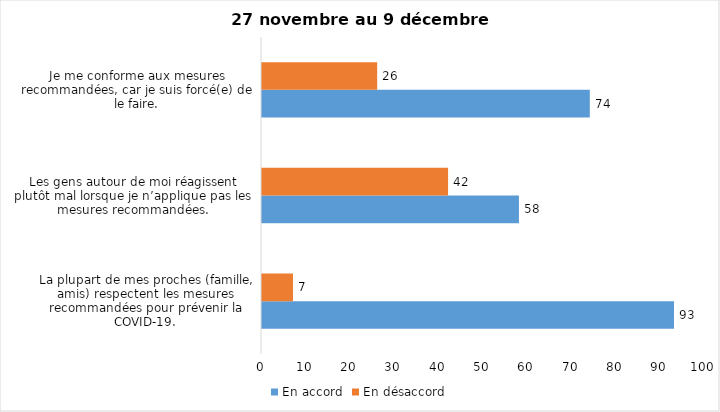
| Category | En accord | En désaccord |
|---|---|---|
| La plupart de mes proches (famille, amis) respectent les mesures recommandées pour prévenir la COVID-19. | 93 | 7 |
| Les gens autour de moi réagissent plutôt mal lorsque je n’applique pas les mesures recommandées. | 58 | 42 |
| Je me conforme aux mesures recommandées, car je suis forcé(e) de le faire. | 74 | 26 |